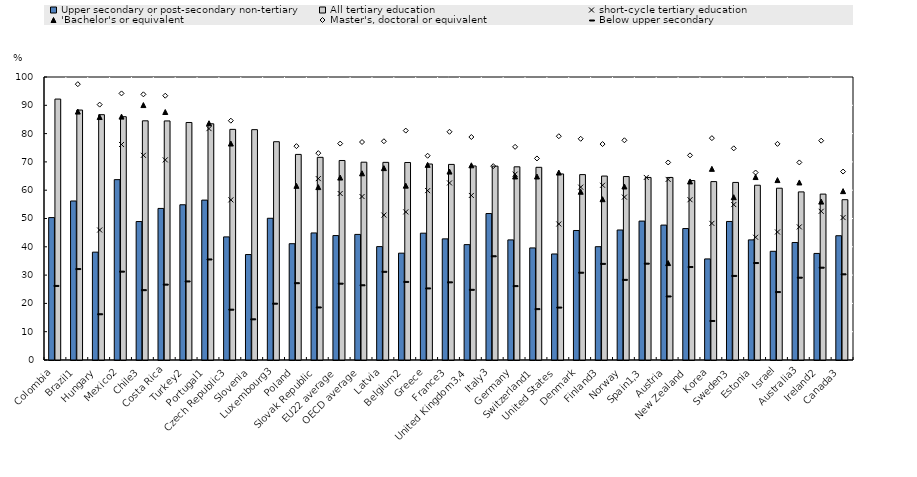
| Category | Upper secondary or post-secondary non-tertiary | All tertiary education |
|---|---|---|
| Colombia | 50.325 | 92.2 |
| Brazil1 | 56.185 | 88.319 |
| Hungary | 38.109 | 86.687 |
| Mexico2 | 63.734 | 85.972 |
| Chile3 | 48.924 | 84.517 |
| Costa Rica | 53.558 | 84.48 |
| Turkey2 | 54.857 | 83.925 |
| Portugal1 | 56.503 | 83.468 |
| Czech Republic3 | 43.501 | 81.494 |
| Slovenia | 37.266 | 81.397 |
| Luxembourg3 | 50.082 | 77.134 |
| Poland | 41.096 | 72.646 |
| Slovak Republic | 44.894 | 71.613 |
| EU22 average | 43.974 | 70.495 |
| OECD average | 44.375 | 69.896 |
| Latvia | 40.068 | 69.841 |
| Belgium2 | 37.75 | 69.789 |
| Greece | 44.813 | 69.25 |
| France3 | 42.806 | 69.11 |
| United Kingdom3,4 | 40.77 | 68.561 |
| Italy3 | 51.752 | 68.501 |
| Germany | 42.44 | 68.263 |
| Switzerland1 | 39.601 | 68.085 |
| United States | 37.462 | 65.749 |
| Denmark | 45.765 | 65.509 |
| Finland3 | 40.037 | 64.999 |
| Norway | 45.941 | 64.825 |
| Spain1,3 | 49.085 | 64.507 |
| Austria | 47.671 | 64.504 |
| New Zealand | 46.453 | 63.408 |
| Korea | 35.715 | 63.041 |
| Sweden3 | 48.952 | 62.746 |
| Estonia | 42.443 | 61.758 |
| Israel | 38.409 | 60.703 |
| Australia3 | 41.522 | 59.402 |
| Ireland2 | 37.659 | 58.62 |
| Canada3 | 43.915 | 56.643 |